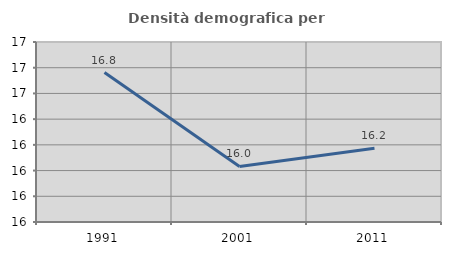
| Category | Densità demografica |
|---|---|
| 1991.0 | 16.762 |
| 2001.0 | 16.032 |
| 2011.0 | 16.173 |